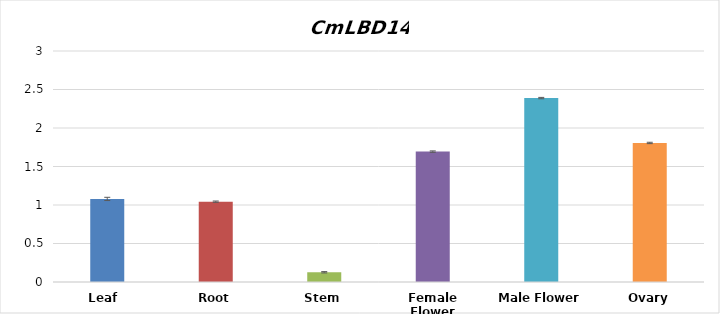
| Category | CmLBD14 |
|---|---|
| Leaf  | 1.079 |
| Root | 1.043 |
| Stem | 0.126 |
| Female Flower | 1.693 |
| Male Flower | 2.389 |
| Ovary | 1.806 |